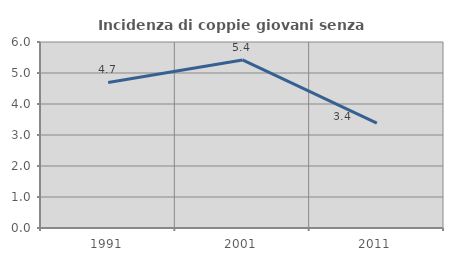
| Category | Incidenza di coppie giovani senza figli |
|---|---|
| 1991.0 | 4.697 |
| 2001.0 | 5.421 |
| 2011.0 | 3.382 |